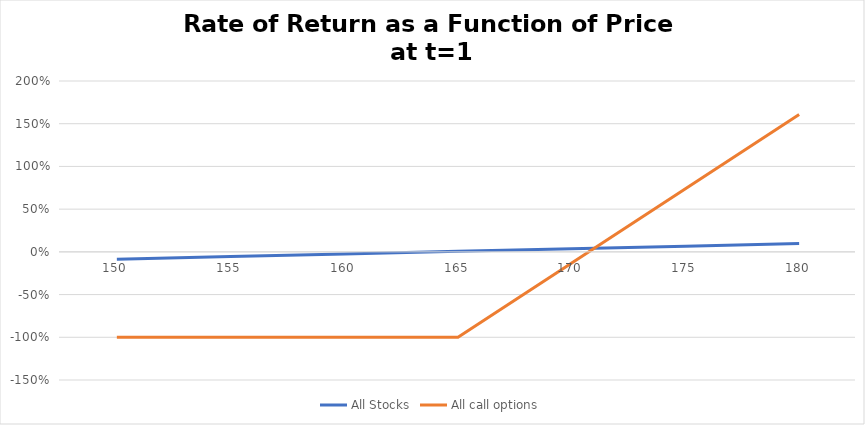
| Category | All Stocks | All call options |
|---|---|---|
| 150.0 | -0.085 | -1 |
| 155.0 | -0.055 | -1 |
| 160.0 | -0.024 | -1 |
| 165.0 | 0.006 | -1 |
| 170.0 | 0.037 | -0.13 |
| 175.0 | 0.067 | 0.739 |
| 180.0 | 0.098 | 1.609 |